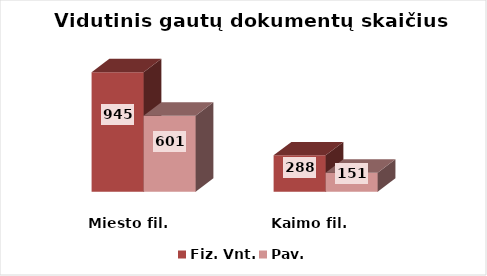
| Category | Fiz. Vnt. | Pav. |
|---|---|---|
| Miesto fil. | 945 | 601 |
| Kaimo fil. | 288 | 151 |